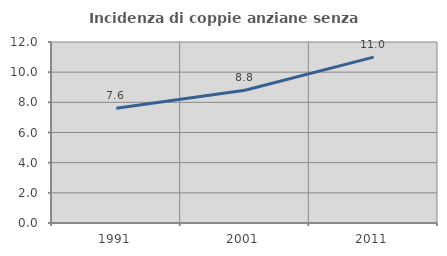
| Category | Incidenza di coppie anziane senza figli  |
|---|---|
| 1991.0 | 7.605 |
| 2001.0 | 8.796 |
| 2011.0 | 10.996 |